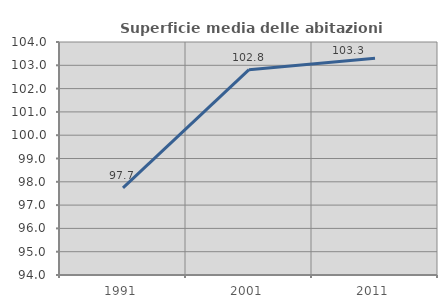
| Category | Superficie media delle abitazioni occupate |
|---|---|
| 1991.0 | 97.743 |
| 2001.0 | 102.813 |
| 2011.0 | 103.301 |